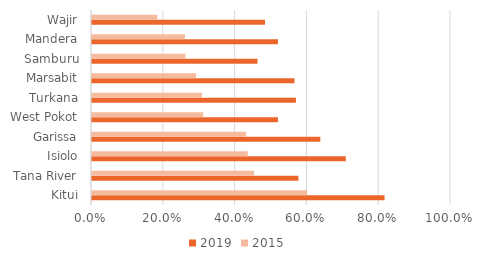
| Category | 2019 | 2015 |
|---|---|---|
| Kitui | 0.815 | 0.599 |
| Tana River | 0.575 | 0.451 |
| Isiolo | 0.707 | 0.434 |
| Garissa | 0.636 | 0.429 |
| West Pokot | 0.518 | 0.31 |
| Turkana | 0.568 | 0.306 |
| Marsabit | 0.564 | 0.29 |
| Samburu | 0.461 | 0.26 |
| Mandera | 0.518 | 0.259 |
| Wajir | 0.482 | 0.182 |